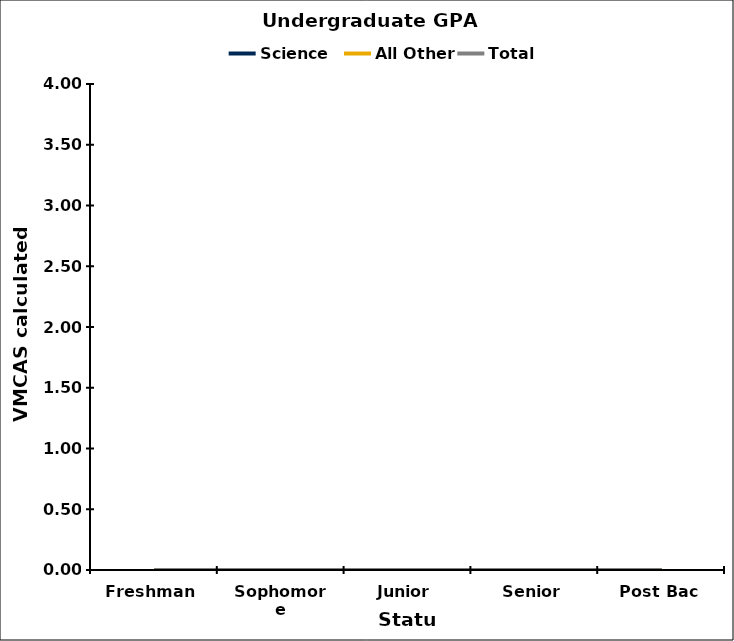
| Category | Science | All Other | Total |
|---|---|---|---|
| Freshman | 0 | 0 | 0 |
| Sophomore | 0 | 0 | 0 |
| Junior | 0 | 0 | 0 |
| Senior | 0 | 0 | 0 |
| Post Bac | 0 | 0 | 0 |